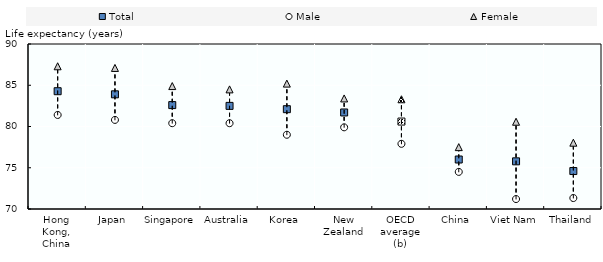
| Category | Total | Male | Female |
|---|---|---|---|
| Hong Kong, China | 84.278 | 81.4 | 87.3 |
| Japan | 83.9 | 80.8 | 87.1 |
| Singapore | 82.595 | 80.4 | 84.9 |
| Australia | 82.5 | 80.4 | 84.5 |
| Korea | 82.1 | 79 | 85.2 |
| New Zealand | 81.7 | 79.9 | 83.4 |
| OECD average (b) | 80.6 | 77.9 | 83.3 |
| China | 76 | 74.5 | 77.5 |
| Viet Nam | 75.778 | 71.207 | 80.577 |
| Thailand | 74.601 | 71.329 | 78.037 |